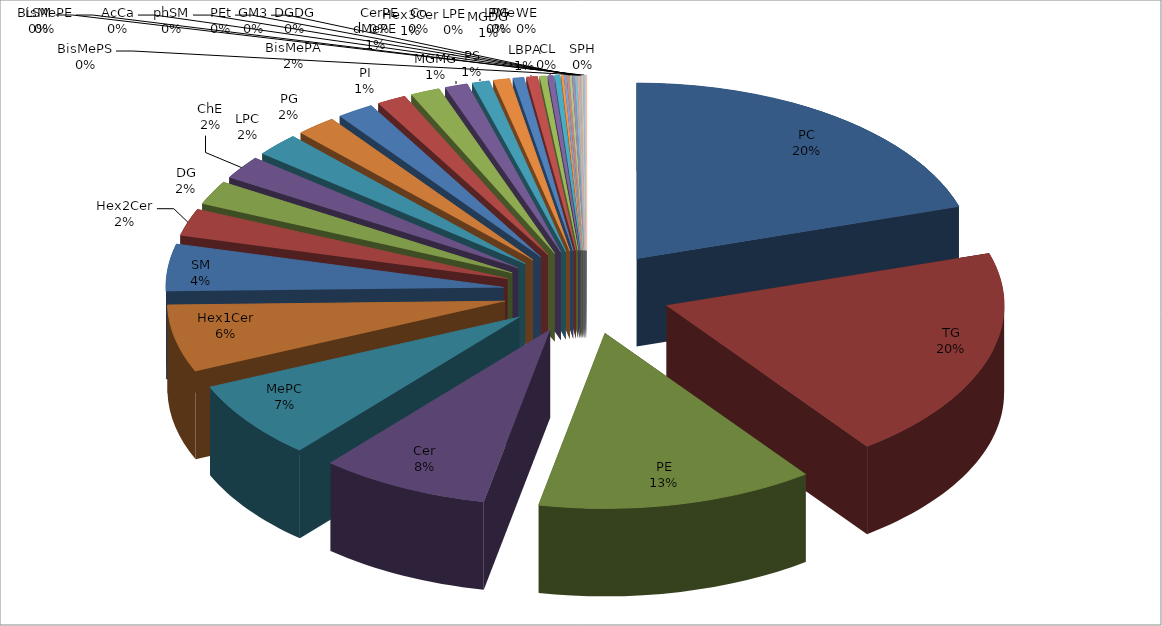
| Category | Series 0 |
|---|---|
| PC | 388 |
| TG | 378 |
| PE | 255 |
| Cer | 156 |
| MePC | 138 |
| Hex1Cer | 119 |
| SM | 83 |
| Hex2Cer | 48 |
| DG | 42 |
| ChE | 41 |
| LPC | 41 |
| PG | 37 |
| BisMePA | 34 |
| PI | 27 |
| dMePE | 27 |
| MGMG | 21 |
| PS | 16 |
| MGDG | 15 |
| Hex3Cer | 10 |
| LBPA | 10 |
| LPE | 6 |
| CL | 5 |
| PMe | 5 |
| CerPE | 2 |
| Co | 2 |
| DGDG | 2 |
| GM3 | 2 |
| PEt | 2 |
| phSM | 2 |
| AcCa | 1 |
| BisMePE | 1 |
| BisMePS | 1 |
| LSM | 1 |
| SPH | 1 |
| WE | 1 |
| LPG | 1 |